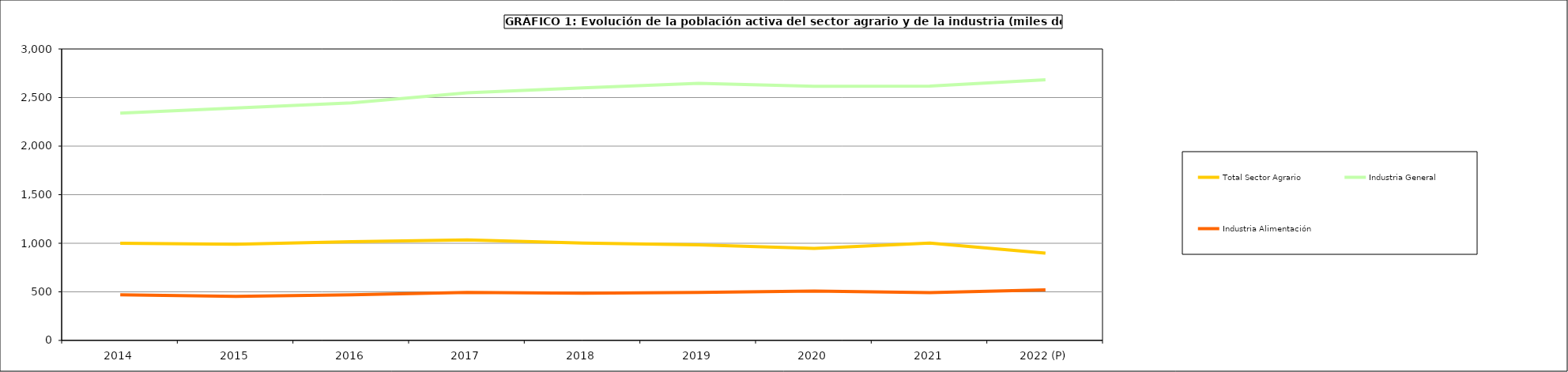
| Category | Total Sector Agrario | Industria General | Industria Alimentación |
|---|---|---|---|
| 2014 | 1000.9 | 2339.7 | 468.5 |
| 2015 | 990.325 | 2391.725 | 454.1 |
| 2016 | 1016.75 | 2445.73 | 468.93 |
| 2017 | 1034 | 2548.2 | 494.3 |
| 2018 | 1002.675 | 2599.175 | 485.3 |
| 2019 | 983.3 | 2646.575 | 493.625 |
| 2020 | 946.55 | 2616.825 | 508.925 |
| 2021 | 1001.2 | 2618 | 492.4 |
| 2022 (P) | 898.8 | 2682.3 | 521.3 |